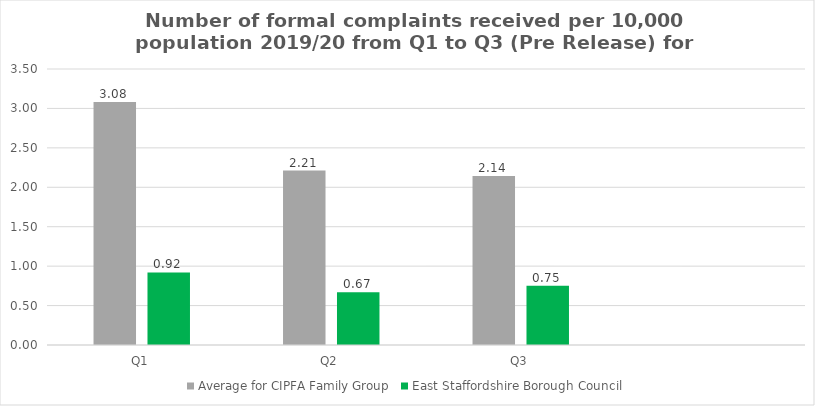
| Category | Average for CIPFA Family Group | East Staffordshire Borough Council |
|---|---|---|
| Q1 | 3.082 | 0.92 |
| Q2 | 2.212 | 0.67 |
| Q3 | 2.143 | 0.75 |